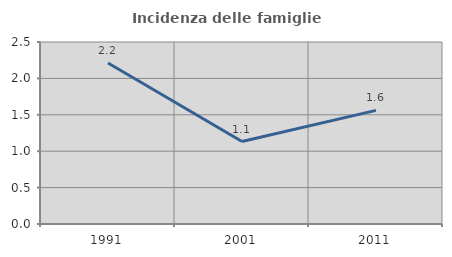
| Category | Incidenza delle famiglie numerose |
|---|---|
| 1991.0 | 2.212 |
| 2001.0 | 1.132 |
| 2011.0 | 1.561 |